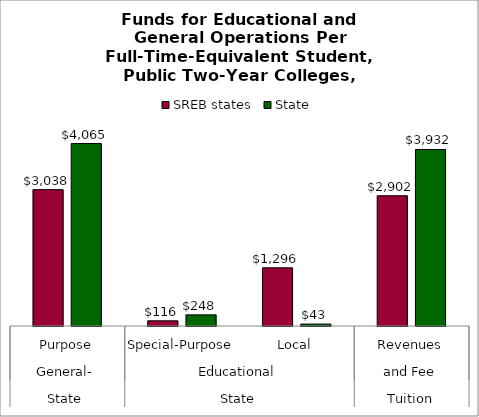
| Category | SREB states | State |
|---|---|---|
| 0 | 3037.942 | 4064.752 |
| 1 | 115.911 | 248.265 |
| 2 | 1296.279 | 42.73 |
| 3 | 2901.918 | 3932.486 |